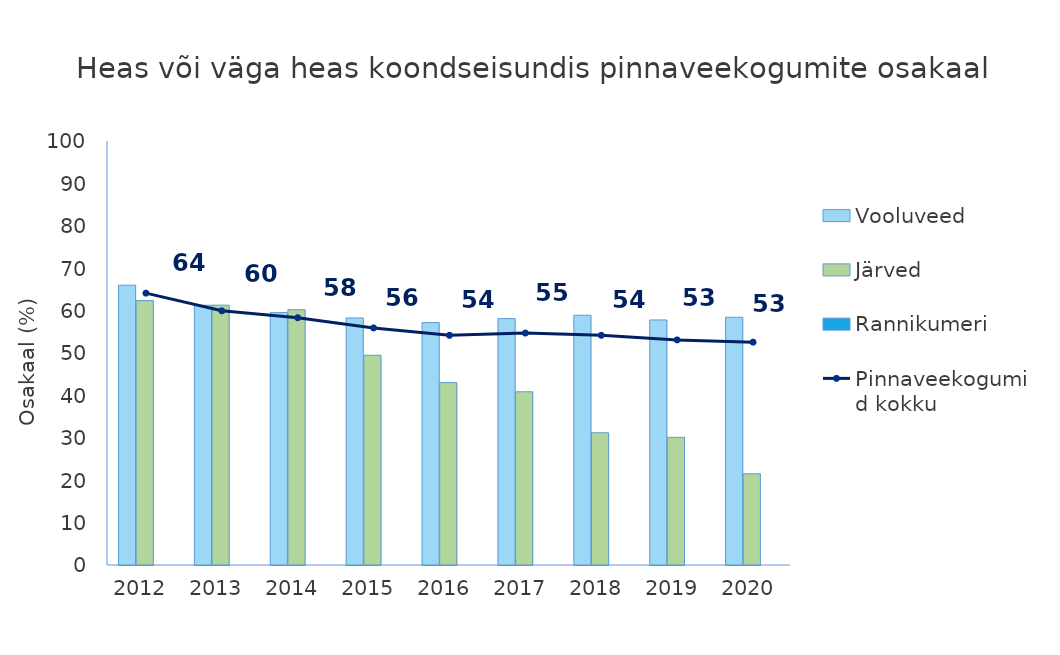
| Category | Vooluveed | Järved | Rannikumeri |
|---|---|---|---|
| 2012.0 | 65.984 | 62.366 | 0 |
| 2013.0 | 61.26 | 61.29 | 0 |
| 2014.0 | 59.528 | 60.215 | 0 |
| 2015.0 | 58.268 | 49.462 | 0 |
| 2016.0 | 57.165 | 43.011 | 0 |
| 2017.0 | 58.11 | 40.86 | 0 |
| 2018.0 | 58.898 | 31.183 | 0 |
| 2019.0 | 57.795 | 30.108 | 0 |
| 2020.0 | 58.425 | 21.505 | 0 |